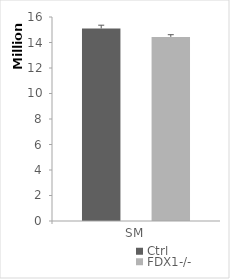
| Category | Ctrl | FDX1-/- |
|---|---|---|
| SM | 15100952.772 | 14440423.954 |